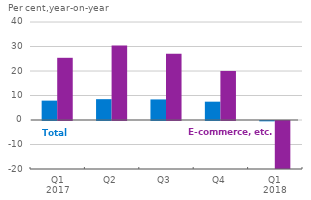
| Category | Total | E-commerce, etc. |
|---|---|---|
| Q1
2017 | 7.909 | 25.389 |
| Q2 | 8.502 | 30.455 |
| Q3 | 8.398 | 26.993 |
| Q4 | 7.48 | 20.013 |
| Q1
2018 | -0.133 | -19.668 |